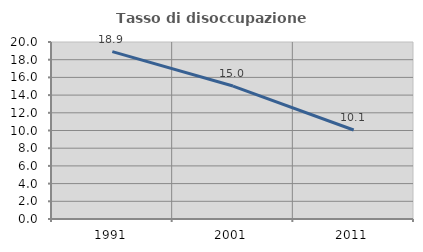
| Category | Tasso di disoccupazione giovanile  |
|---|---|
| 1991.0 | 18.919 |
| 2001.0 | 15.023 |
| 2011.0 | 10.059 |